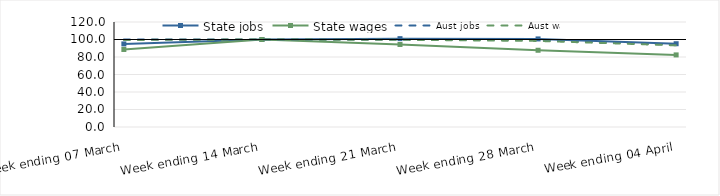
| Category | State jobs | State wages | Aust jobs | Aust wages |
|---|---|---|---|---|
| 2020-03-07 | 94.935 | 88.61 | 100.003 | 99.487 |
| 2020-03-14 | 100 | 100 | 100 | 100 |
| 2020-03-21 | 100.961 | 94.32 | 99.966 | 99.652 |
| 2020-03-28 | 100.651 | 87.715 | 99.451 | 98.382 |
| 2020-04-04 | 95.172 | 82.395 | 93.968 | 93.326 |